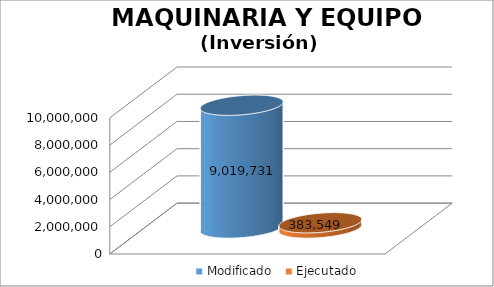
| Category | Modificado | Ejecutado |
|---|---|---|
| 0 | 9019731 | 383549.42 |